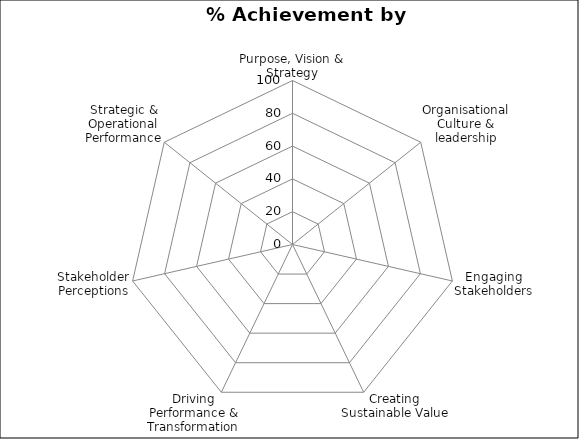
| Category | % Target | % Score |
|---|---|---|
| Purpose, Vision & Strategy | 0 | 0 |
| Organisational Culture & leadership | 0 | 0 |
| Engaging Stakeholders | 0 | 0 |
| Creating Sustainable Value | 0 | 0 |
| Driving Performance & Transformation | 0 | 0 |
| Stakeholder Perceptions | 0 | 0 |
| Strategic & Operational Performance | 0 | 0 |